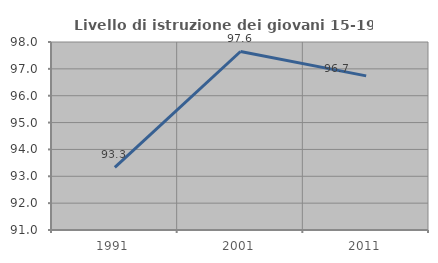
| Category | Livello di istruzione dei giovani 15-19 anni |
|---|---|
| 1991.0 | 93.333 |
| 2001.0 | 97.647 |
| 2011.0 | 96.739 |